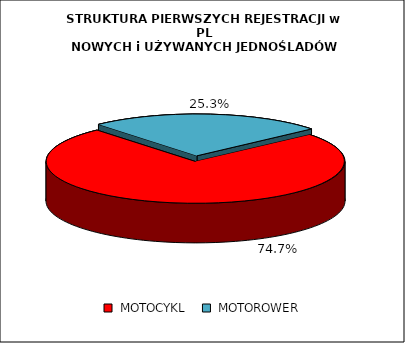
| Category | RAZEM |
|---|---|
|  MOTOCYKL  | 0.747 |
|  MOTOROWER  | 0.253 |